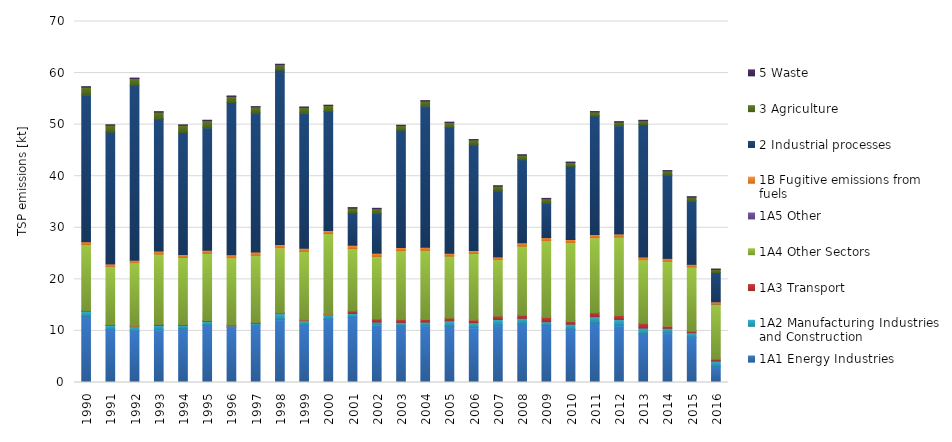
| Category | 1A1 | 1A2 | 1A3 | 1A4 | 1A5 | 1B | 2 | 3 | 5 |
|---|---|---|---|---|---|---|---|---|---|
| 1990.0 | 12.82 | 0.967 | 0.136 | 12.827 | 0 | 0.564 | 28.468 | 1.501 | 0.078 |
| 1991.0 | 10.264 | 0.804 | 0.143 | 11.194 | 0 | 0.588 | 25.555 | 1.342 | 0.077 |
| 1992.0 | 9.889 | 0.929 | 0.157 | 12.212 | 0 | 0.54 | 33.897 | 1.326 | 0.077 |
| 1993.0 | 10.21 | 0.891 | 0.163 | 13.632 | 0 | 0.584 | 25.594 | 1.363 | 0.077 |
| 1994.0 | 10.492 | 0.588 | 0.146 | 13.024 | 0 | 0.565 | 23.672 | 1.389 | 0.077 |
| 1995.0 | 11.122 | 0.719 | 0.163 | 13.048 | 0 | 0.596 | 23.738 | 1.394 | 0.076 |
| 1996.0 | 10.673 | 0.298 | 0.165 | 13.027 | 0 | 0.597 | 29.551 | 1.166 | 0.077 |
| 1997.0 | 11.07 | 0.416 | 0.168 | 13.012 | 0 | 0.616 | 27.016 | 1.124 | 0.075 |
| 1998.0 | 12.159 | 1.194 | 0.17 | 12.561 | 0 | 0.68 | 33.805 | 1.072 | 0.074 |
| 1999.0 | 11.096 | 0.891 | 0.171 | 13.274 | 0 | 0.609 | 26.227 | 1.08 | 0.074 |
| 2000.0 | 12.274 | 0.834 | 0.181 | 15.571 | 0 | 0.633 | 23.098 | 1.11 | 0.072 |
| 2001.0 | 12.663 | 0.723 | 0.541 | 12.008 | 0 | 0.684 | 6.235 | 0.98 | 0.075 |
| 2002.0 | 11.149 | 0.571 | 0.583 | 12.143 | 0 | 0.631 | 7.684 | 0.944 | 0.072 |
| 2003.0 | 10.943 | 0.706 | 0.559 | 13.359 | 0 | 0.609 | 22.723 | 0.917 | 0.071 |
| 2004.0 | 10.992 | 0.716 | 0.514 | 13.407 | 0 | 0.614 | 27.386 | 0.953 | 0.071 |
| 2005.0 | 10.888 | 1.042 | 0.562 | 12.013 | 0 | 0.58 | 24.42 | 0.905 | 0.07 |
| 2006.0 | 10.586 | 1 | 0.576 | 12.869 | 0 | 0.563 | 20.529 | 0.92 | 0.069 |
| 2007.0 | 11.007 | 1.218 | 0.66 | 10.902 | 0 | 0.555 | 12.845 | 0.894 | 0.068 |
| 2008.0 | 11.341 | 1.097 | 0.69 | 13.309 | 0 | 0.646 | 16.127 | 0.881 | 0.067 |
| 2009.0 | 11.097 | 0.683 | 0.86 | 14.828 | 0 | 0.622 | 6.75 | 0.793 | 0.068 |
| 2010.0 | 10.271 | 1.032 | 0.628 | 15.242 | 0 | 0.553 | 14.205 | 0.739 | 0.067 |
| 2011.0 | 11.492 | 1.269 | 0.793 | 14.495 | 0 | 0.659 | 22.965 | 0.796 | 0.068 |
| 2012.0 | 10.971 | 1.231 | 0.788 | 15.207 | 0 | 0.604 | 20.975 | 0.734 | 0.069 |
| 2013.0 | 9.399 | 1.158 | 0.911 | 12.305 | 0 | 0.545 | 25.702 | 0.75 | 0.07 |
| 2014.0 | 9.628 | 0.88 | 0.453 | 12.555 | 0 | 0.548 | 16.216 | 0.743 | 0.07 |
| 2015.0 | 8.702 | 0.922 | 0.401 | 12.396 | 0.001 | 0.486 | 12.313 | 0.731 | 0.074 |
| 2016.0 | 3.15 | 0.996 | 0.449 | 10.622 | 0.002 | 0.418 | 5.683 | 0.603 | 0.078 |